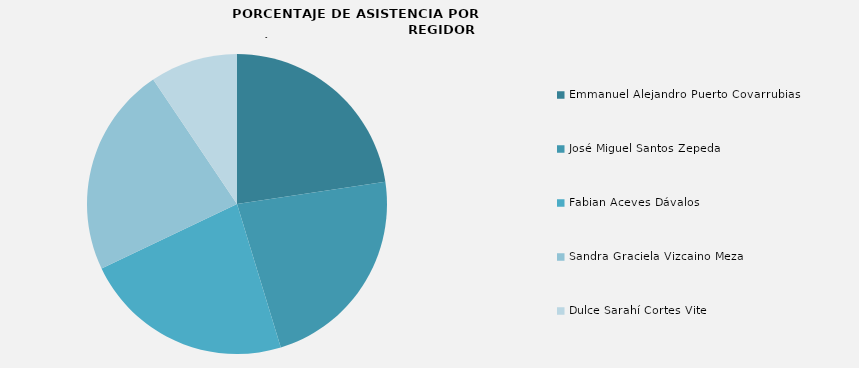
| Category | Series 0 |
|---|---|
| Emmanuel Alejandro Puerto Covarrubias | 100 |
| José Miguel Santos Zepeda | 100 |
| Fabian Aceves Dávalos | 100 |
| Sandra Graciela Vizcaino Meza | 100 |
| Dulce Sarahí Cortes Vite | 41.667 |